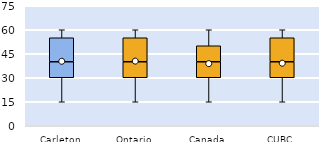
| Category | 25th | 50th | 75th |
|---|---|---|---|
| Carleton | 30 | 10 | 15 |
| Ontario | 30 | 10 | 15 |
| Canada | 30 | 10 | 10 |
| CUBC | 30 | 10 | 15 |